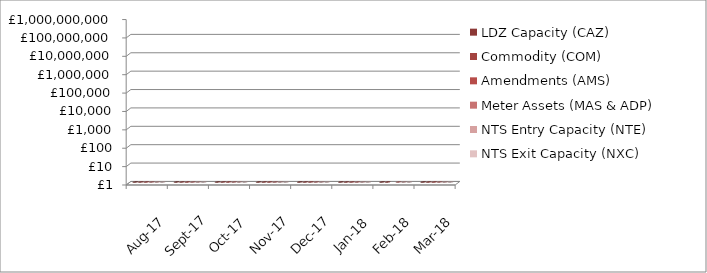
| Category | LDZ Capacity (CAZ) | Commodity (COM) | Amendments (AMS) | Meter Assets (MAS & ADP) | NTS Entry Capacity (NTE) | NTS Exit Capacity (NXC) |
|---|---|---|---|---|---|---|
| 2017-08-01 | 298862406.46 | 16761360.58 | 1357290.74 | 193840.59 | 1969937.93 | 23465025.38 |
| 2017-09-01 | 289415948.74 | 20098400.73 | 205300.25 | 187587.95 | 1855267.92 | 22811559.53 |
| 2017-10-01 | 299201864.14 | 26855499.51 | 321543.98 | 193840.32 | 11176717.5 | 18097117.82 |
| 2017-11-01 | 290194555.87 | 41901625.24 | 281193.04 | 187587.95 | 12089719.21 | 18734838.83 |
| 2017-12-01 | 299923728.54 | 49314715.49 | 486751.91 | 193840.34 | 12089719.21 | 18734838.83 |
| 2018-01-01 | 300085873.04 | 51013861.41 | 398601 | 193840 | 13468961.26 | 18693319.21 |
| 2018-02-01 | 271243893.07 | 49577294.91 | -97584.69 | 175082.41 | 10887736.94 | 16944144.32 |
| 2018-03-01 | 300714752.62 | 47885458.16 | 435828.94 | 193565.33 | 12522228.64 | 16944144.32 |